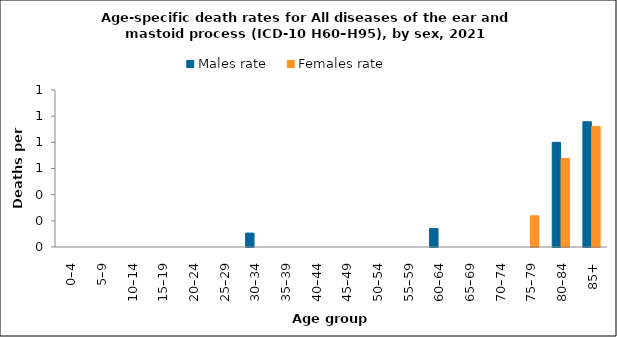
| Category | Males rate | Females rate |
|---|---|---|
| 0–4 | 0 | 0 |
| 5–9 | 0 | 0 |
| 10–14 | 0 | 0 |
| 15–19 | 0 | 0 |
| 20–24 | 0 | 0 |
| 25–29 | 0 | 0 |
| 30–34 | 0.106 | 0 |
| 35–39 | 0 | 0 |
| 40–44 | 0 | 0 |
| 45–49 | 0 | 0 |
| 50–54 | 0 | 0 |
| 55–59 | 0 | 0 |
| 60–64 | 0.141 | 0 |
| 65–69 | 0 | 0 |
| 70–74 | 0 | 0 |
| 75–79 | 0 | 0.238 |
| 80–84 | 0.8 | 0.677 |
| 85+ | 0.958 | 0.922 |